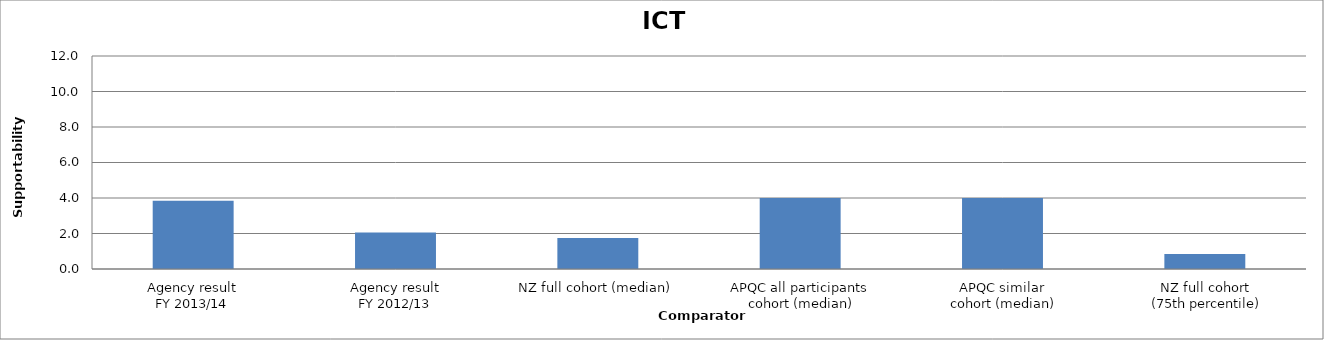
| Category | Result |
|---|---|
| Agency result
FY 2013/14 | 3.85 |
| Agency result
FY 2012/13 | 2.06 |
| NZ full cohort (median) | 1.75 |
| APQC all participants
 cohort (median) | 4 |
| APQC similar
 cohort (median) | 4 |
| NZ full cohort
 (75th percentile) | 0.85 |